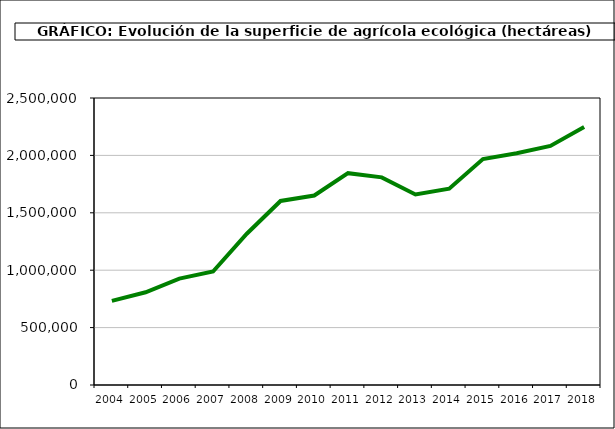
| Category | Superficie (ha) |
|---|---|
| 2004.0 | 733182 |
| 2005.0 | 807569 |
| 2006.0 | 926390 |
| 2007.0 | 988323 |
| 2008.0 | 1317752 |
| 2009.0 | 1602868 |
| 2010.0 | 1650866 |
| 2011.0 | 1845039 |
| 2012.0 | 1808492 |
| 2013.0 | 1659916 |
| 2014.0 | 1710493 |
| 2015.0 | 1968570 |
| 2016.0 | 2018802 |
| 2017.0 | 2082173 |
| 2018.0 | 2246475 |